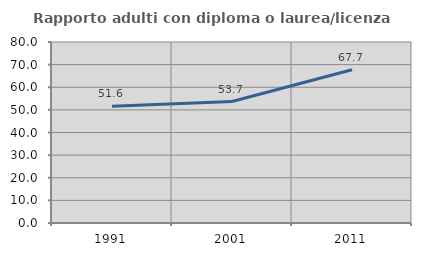
| Category | Rapporto adulti con diploma o laurea/licenza media  |
|---|---|
| 1991.0 | 51.613 |
| 2001.0 | 53.689 |
| 2011.0 | 67.719 |